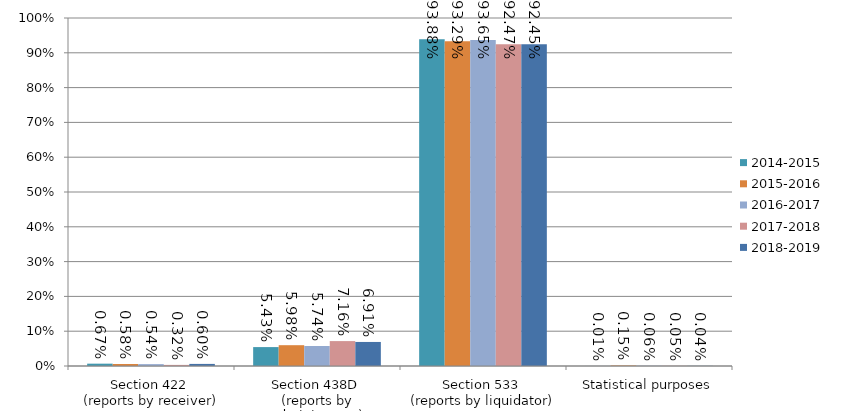
| Category | 2014-2015 | 2015-2016 | 2016-2017 | 2017-2018 | 2018-2019 |
|---|---|---|---|---|---|
| Section 422 
(reports by receiver) | 0.007 | 0.006 | 0.005 | 0.003 | 0.006 |
| Section 438D 
(reports by administrator) | 0.054 | 0.06 | 0.057 | 0.072 | 0.069 |
| Section 533 
(reports by liquidator) | 0.939 | 0.933 | 0.937 | 0.925 | 0.925 |
| Statistical purposes | 0 | 0.001 | 0.001 | 0.001 | 0 |